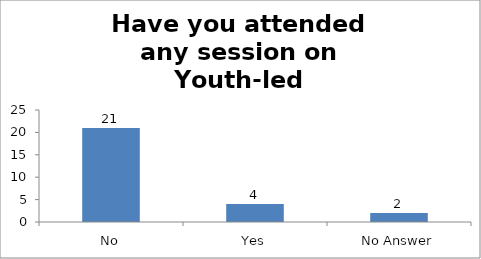
| Category | Have you attended any session on Youth-led Changemaking before? |
|---|---|
| No | 21 |
| Yes | 4 |
| No Answer | 2 |